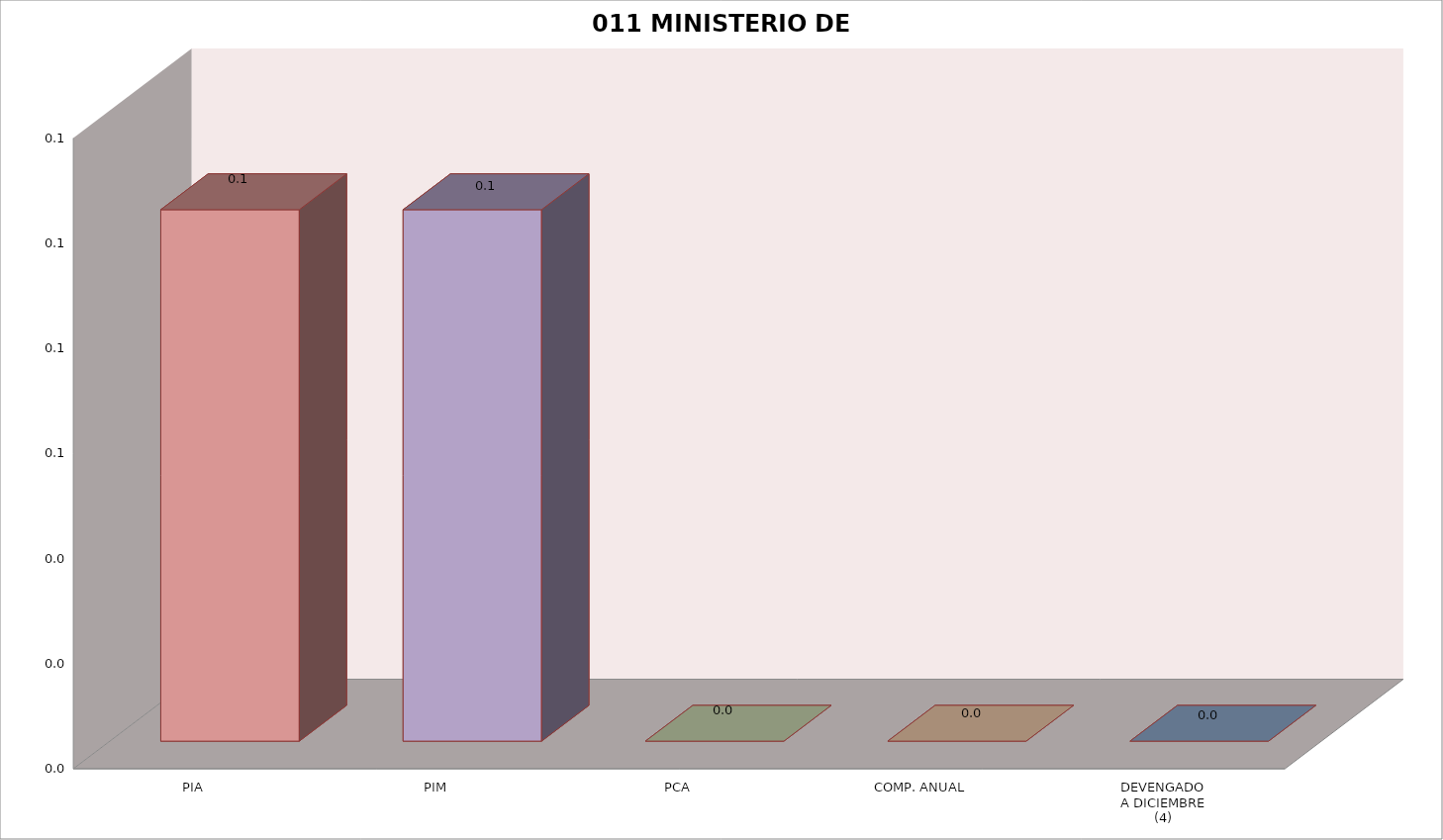
| Category | 011 MINISTERIO DE SALUD |
|---|---|
| PIA | 0.101 |
| PIM | 0.101 |
| PCA | 0 |
| COMP. ANUAL | 0 |
| DEVENGADO
A DICIEMBRE
(4) | 0 |